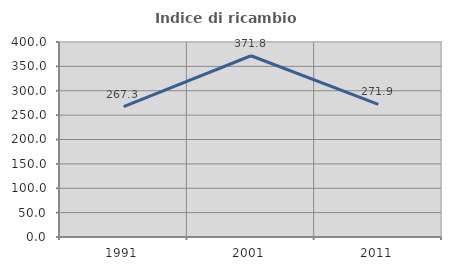
| Category | Indice di ricambio occupazionale  |
|---|---|
| 1991.0 | 267.308 |
| 2001.0 | 371.795 |
| 2011.0 | 271.875 |